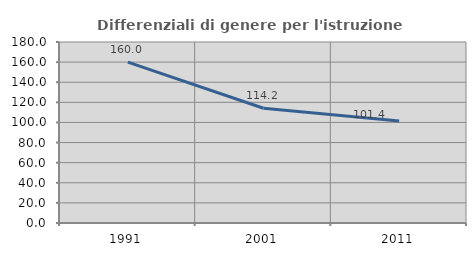
| Category | Differenziali di genere per l'istruzione superiore |
|---|---|
| 1991.0 | 160.048 |
| 2001.0 | 114.156 |
| 2011.0 | 101.35 |